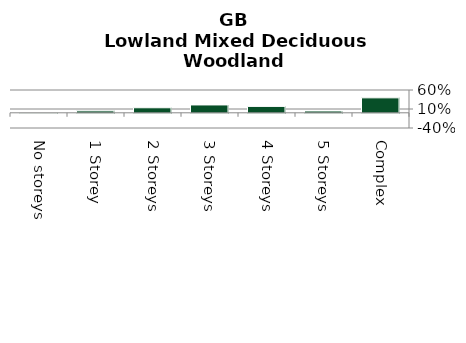
| Category | Lowland Mixed Deciduous Woodland |
|---|---|
| No storeys | 0 |
| 1 Storey | 0.051 |
| 2 Storeys | 0.132 |
| 3 Storeys | 0.207 |
| 4 Storeys | 0.168 |
| 5 Storeys | 0.048 |
| Complex | 0.394 |